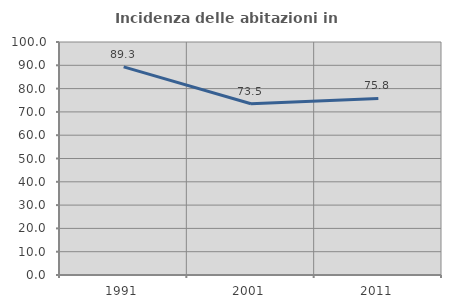
| Category | Incidenza delle abitazioni in proprietà  |
|---|---|
| 1991.0 | 89.308 |
| 2001.0 | 73.482 |
| 2011.0 | 75.769 |